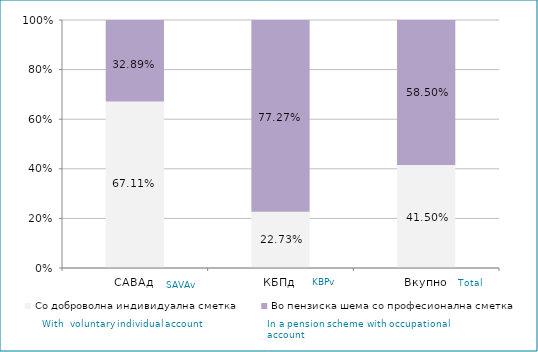
| Category | Со доброволна индивидуална сметка  | Во пензиска шема со професионална сметка |
|---|---|---|
| САВАд | 0.671 | 0.329 |
| КБПд | 0.227 | 0.773 |
| Вкупно | 0.415 | 0.585 |